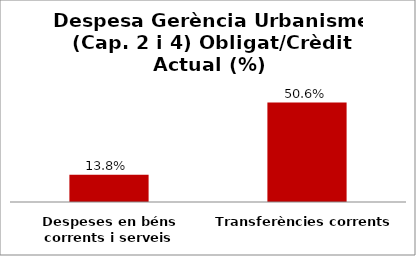
| Category | Series 0 |
|---|---|
| Despeses en béns corrents i serveis | 0.138 |
| Transferències corrents | 0.506 |